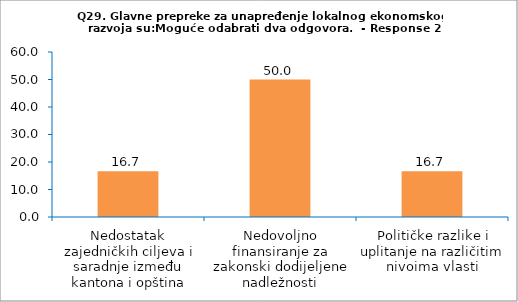
| Category | Series 0 |
|---|---|
| Nedostatak zajedničkih ciljeva i saradnje između kantona i opština | 16.667 |
| Nedovoljno finansiranje za zakonski dodijeljene nadležnosti | 50 |
| Političke razlike i uplitanje na različitim nivoima vlasti | 16.667 |